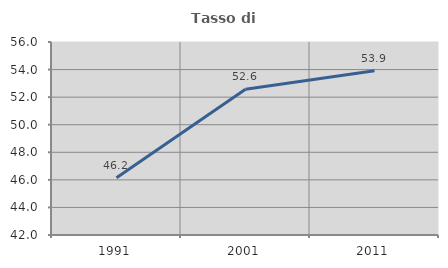
| Category | Tasso di occupazione   |
|---|---|
| 1991.0 | 46.154 |
| 2001.0 | 52.566 |
| 2011.0 | 53.916 |